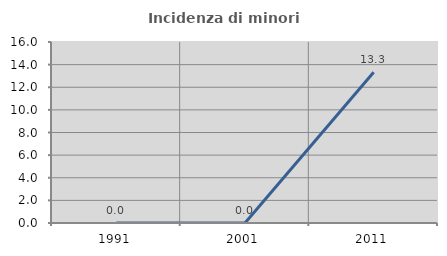
| Category | Incidenza di minori stranieri |
|---|---|
| 1991.0 | 0 |
| 2001.0 | 0 |
| 2011.0 | 13.333 |